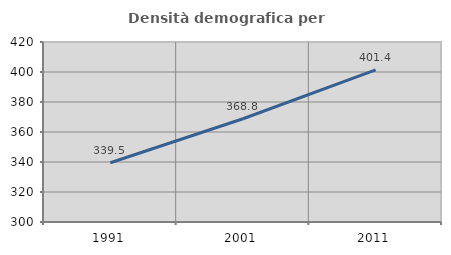
| Category | Densità demografica |
|---|---|
| 1991.0 | 339.52 |
| 2001.0 | 368.817 |
| 2011.0 | 401.386 |